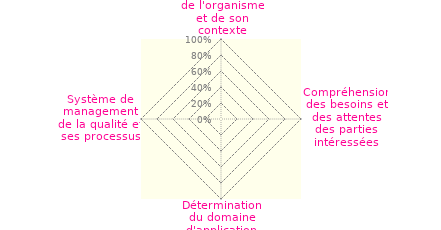
| Category | Art 4 |
|---|---|
| 0 | 0 |
| 1 | 0 |
| 2 | 0 |
| 3 | 0 |